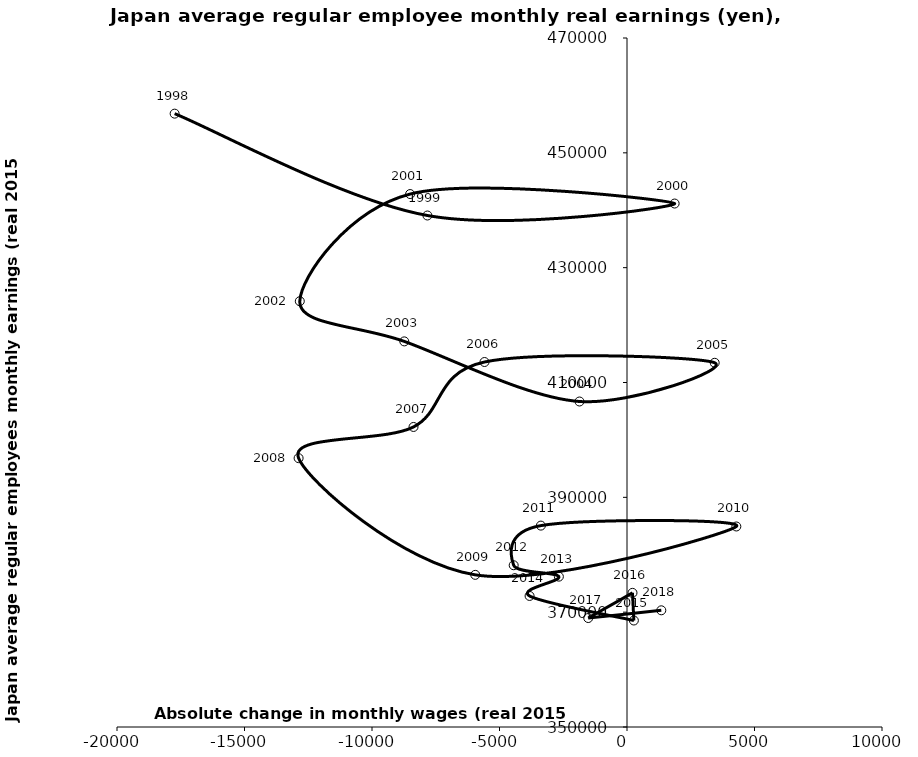
| Category | Series 0 |
|---|---|
| -17739.397689146397 | 456824.825 |
| -7827.7268140351225 | 439085.427 |
| 1868.2383257124748 | 441169.371 |
| -8504.975453449733 | 442821.904 |
| -12831.512641215231 | 424159.42 |
| -8734.434963203763 | 417158.879 |
| -1863.068032315612 | 406690.55 |
| 3439.028352579742 | 413432.742 |
| -5588.126152523415 | 413568.607 |
| -8371.726847186947 | 402256.49 |
| -12878.245067497424 | 396825.153 |
| -5950.7566034345655 | 376500 |
| 4287.735849056597 | 384923.64 |
| -3377.4385323193565 | 385075.472 |
| -4443.790128806082 | 378168.763 |
| -2671.7552887364 | 376187.891 |
| -3820.4457202505146 | 372825.253 |
| 269.05541905539576 | 368547 |
| 215.55472636816557 | 373363.363 |
| -1519.9314358606061 | 368978.109 |
| 1345.391038905771 | 370323.5 |